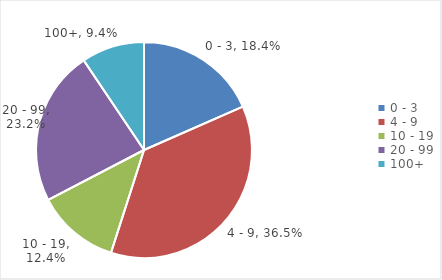
| Category | Enterprises  |
|---|---|
| 0 - 3 | 0.184 |
| 4 - 9 | 0.365 |
| 10 - 19 | 0.124 |
| 20 - 99 | 0.232 |
| 100+ | 0.094 |